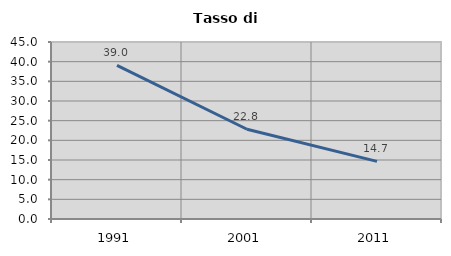
| Category | Tasso di disoccupazione   |
|---|---|
| 1991.0 | 39.044 |
| 2001.0 | 22.824 |
| 2011.0 | 14.659 |